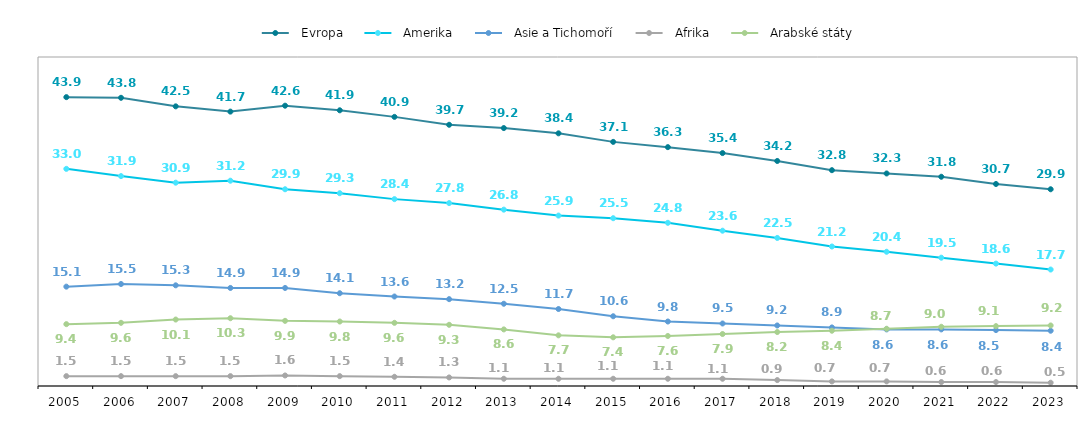
| Category |   Evropa |   Amerika |   Asie a Tichomoří |   Afrika |   Arabské státy |
|---|---|---|---|---|---|
| 2005.0 | 43.9 | 33 | 15.1 | 1.5 | 9.4 |
| 2006.0 | 43.8 | 31.9 | 15.5 | 1.5 | 9.6 |
| 2007.0 | 42.5 | 30.9 | 15.3 | 1.5 | 10.1 |
| 2008.0 | 41.7 | 31.2 | 14.9 | 1.5 | 10.3 |
| 2009.0 | 42.6 | 29.9 | 14.9 | 1.6 | 9.9 |
| 2010.0 | 41.9 | 29.3 | 14.1 | 1.5 | 9.8 |
| 2011.0 | 40.9 | 28.4 | 13.6 | 1.4 | 9.6 |
| 2012.0 | 39.7 | 27.8 | 13.2 | 1.3 | 9.3 |
| 2013.0 | 39.2 | 26.8 | 12.5 | 1.1 | 8.6 |
| 2014.0 | 38.4 | 25.9 | 11.7 | 1.1 | 7.7 |
| 2015.0 | 37.1 | 25.5 | 10.6 | 1.1 | 7.4 |
| 2016.0 | 36.3 | 24.8 | 9.8 | 1.1 | 7.6 |
| 2017.0 | 35.4 | 23.6 | 9.5 | 1.1 | 7.9 |
| 2018.0 | 34.2 | 22.5 | 9.2 | 0.9 | 8.2 |
| 2019.0 | 32.8 | 21.2 | 8.9 | 0.7 | 8.4 |
| 2020.0 | 32.3 | 20.4 | 8.6 | 0.7 | 8.7 |
| 2021.0 | 31.8 | 19.5 | 8.6 | 0.6 | 9 |
| 2022.0 | 30.7 | 18.6 | 8.5 | 0.6 | 9.1 |
| 2023.0 | 29.9 | 17.7 | 8.4 | 0.5 | 9.2 |